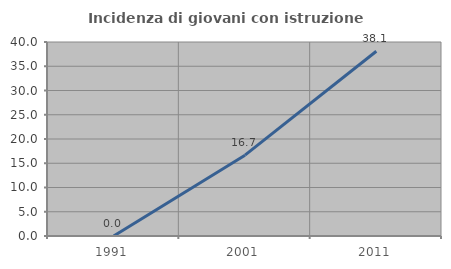
| Category | Incidenza di giovani con istruzione universitaria |
|---|---|
| 1991.0 | 0 |
| 2001.0 | 16.667 |
| 2011.0 | 38.095 |